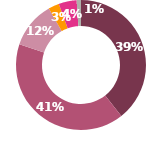
| Category | Series 0 |
|---|---|
| 0 | 22000 |
| 1 | 22800 |
| 2 | 6500 |
| 3 | 1500 |
| 4 | 2500 |
| 5 | 0 |
| 6 | 600 |